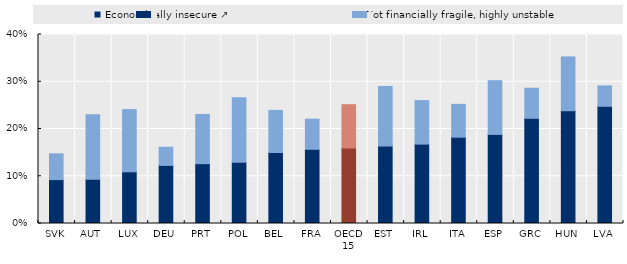
| Category | Economically insecure ↗ | Not financially fragile, highly unstable |
|---|---|---|
| SVK | 0.093 | 0.055 |
| AUT | 0.094 | 0.137 |
| LUX | 0.109 | 0.132 |
| DEU | 0.123 | 0.038 |
| PRT | 0.127 | 0.104 |
| POL | 0.13 | 0.136 |
| BEL | 0.15 | 0.089 |
| FRA | 0.157 | 0.064 |
| OECD 15 | 0.16 | 0.092 |
| EST | 0.164 | 0.126 |
| IRL | 0.168 | 0.092 |
| ITA | 0.183 | 0.07 |
| ESP | 0.189 | 0.114 |
| GRC | 0.223 | 0.064 |
| HUN | 0.239 | 0.114 |
| LVA | 0.248 | 0.043 |